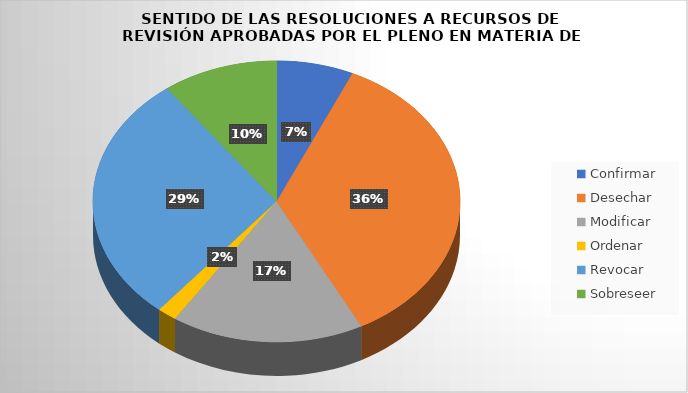
| Category | Series 0 |
|---|---|
| Confirmar | 4 |
| Desechar | 21 |
| Modificar | 10 |
| Ordenar | 1 |
| Revocar | 17 |
| Sobreseer | 6 |